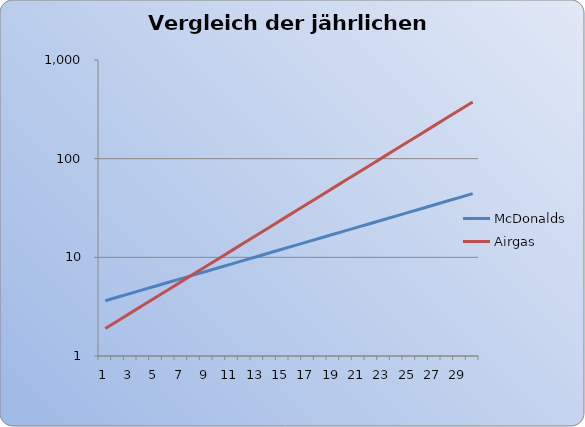
| Category | McDonalds | Airgas |
|---|---|---|
| 0 | 3.63 | 1.9 |
| 1 | 3.957 | 2.28 |
| 2 | 4.313 | 2.736 |
| 3 | 4.701 | 3.283 |
| 4 | 5.124 | 3.94 |
| 5 | 5.585 | 4.728 |
| 6 | 6.088 | 5.673 |
| 7 | 6.636 | 6.808 |
| 8 | 7.233 | 8.17 |
| 9 | 7.884 | 9.804 |
| 10 | 8.594 | 11.764 |
| 11 | 9.367 | 14.117 |
| 12 | 10.21 | 16.941 |
| 13 | 11.129 | 20.329 |
| 14 | 12.13 | 24.394 |
| 15 | 13.222 | 29.273 |
| 16 | 14.412 | 35.128 |
| 17 | 15.709 | 42.154 |
| 18 | 17.123 | 50.584 |
| 19 | 18.664 | 60.701 |
| 20 | 20.344 | 72.841 |
| 21 | 22.175 | 87.41 |
| 22 | 24.171 | 104.892 |
| 23 | 26.346 | 125.87 |
| 24 | 28.717 | 151.044 |
| 25 | 31.302 | 181.253 |
| 26 | 34.119 | 217.503 |
| 27 | 37.19 | 261.004 |
| 28 | 40.537 | 313.205 |
| 29 | 44.185 | 375.846 |